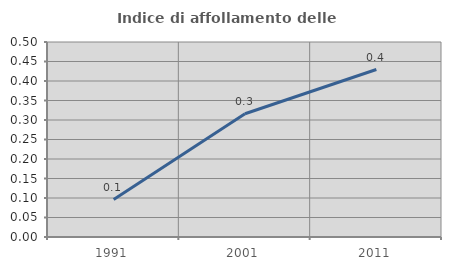
| Category | Indice di affollamento delle abitazioni  |
|---|---|
| 1991.0 | 0.096 |
| 2001.0 | 0.316 |
| 2011.0 | 0.429 |